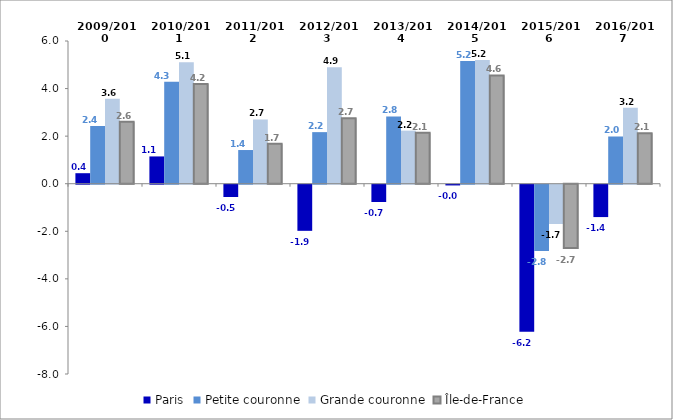
| Category | Paris | Petite couronne | Grande couronne | Île-de-France |
|---|---|---|---|---|
| 2009/2010 | 0.442 | 2.427 | 3.568 | 2.602 |
| 2010/2011 | 1.147 | 4.285 | 5.11 | 4.187 |
| 2011/2012 | -0.517 | 1.416 | 2.7 | 1.678 |
| 2012/2013 | -1.939 | 2.169 | 4.896 | 2.748 |
| 2013/2014 | -0.727 | 2.831 | 2.232 | 2.142 |
| 2014/2015 | -0.03 | 5.154 | 5.199 | 4.55 |
| 2015/2016 | -6.181 | -2.782 | -1.651 | -2.699 |
| 2016/2017 | -1.36 | 1.985 | 3.191 | 2.125 |